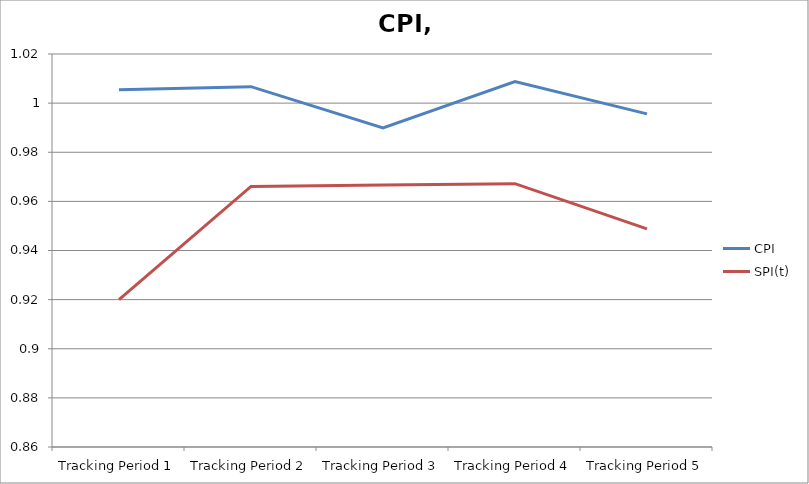
| Category | CPI | SPI(t) |
|---|---|---|
| Tracking Period 1 | 1.005 | 0.92 |
| Tracking Period 2 | 1.007 | 0.966 |
| Tracking Period 3 | 0.99 | 0.967 |
| Tracking Period 4 | 1.009 | 0.967 |
| Tracking Period 5 | 0.996 | 0.949 |